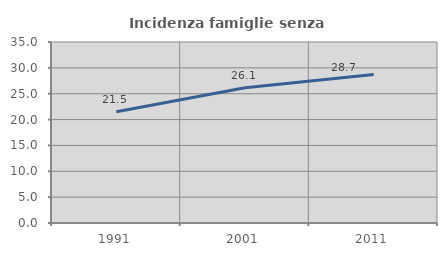
| Category | Incidenza famiglie senza nuclei |
|---|---|
| 1991.0 | 21.498 |
| 2001.0 | 26.149 |
| 2011.0 | 28.715 |